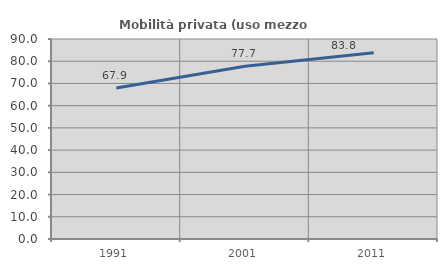
| Category | Mobilità privata (uso mezzo privato) |
|---|---|
| 1991.0 | 67.915 |
| 2001.0 | 77.726 |
| 2011.0 | 83.836 |